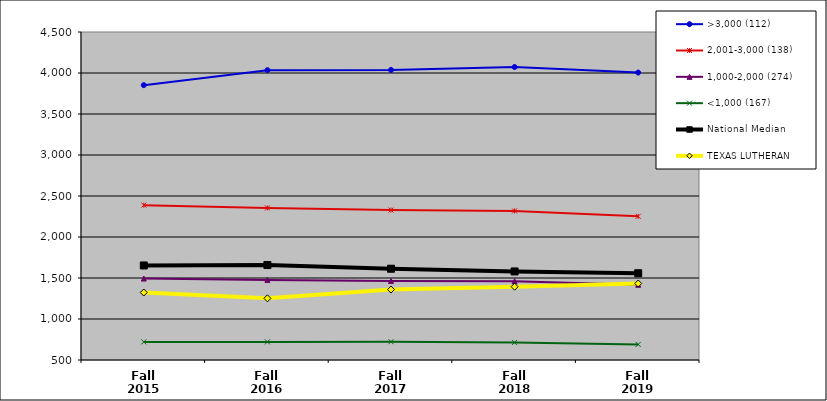
| Category | >3,000 (112) | 2,001-3,000 (138) | 1,000-2,000 (274) | <1,000 (167) | National Median | TEXAS LUTHERAN |
|---|---|---|---|---|---|---|
| Fall 2015 | 3852 | 2388.5 | 1493.5 | 721 | 1653 | 1323 |
| Fall 2016 | 4034.5 | 2354.5 | 1476 | 721 | 1658 | 1252 |
| Fall 2017 | 4037 | 2328.5 | 1464 | 723 | 1613 | 1359 |
| Fall 2018 | 4073 | 2318 | 1460.5 | 714 | 1580 | 1394 |
| Fall 2019 | 4005.5 | 2252 | 1417 | 690 | 1558 | 1433 |